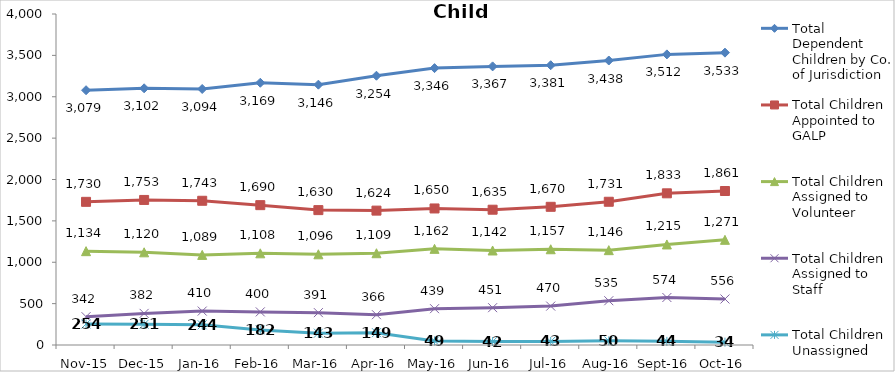
| Category | Total Dependent Children by Co. of Jurisdiction | Total Children Appointed to GALP | Total Children Assigned to Volunteer | Total Children Assigned to Staff | Total Children Unassigned |
|---|---|---|---|---|---|
| Nov-15 | 3079 | 1730 | 1134 | 342 | 254 |
| Dec-15 | 3102 | 1753 | 1120 | 382 | 251 |
| Jan-16 | 3094 | 1743 | 1089 | 410 | 244 |
| Feb-16 | 3169 | 1690 | 1108 | 400 | 182 |
| Mar-16 | 3146 | 1630 | 1096 | 391 | 143 |
| Apr-16 | 3254 | 1624 | 1109 | 366 | 149 |
| May-16 | 3346 | 1650 | 1162 | 439 | 49 |
| Jun-16 | 3367 | 1635 | 1142 | 451 | 42 |
| Jul-16 | 3381 | 1670 | 1157 | 470 | 43 |
| Aug-16 | 3438 | 1731 | 1146 | 535 | 50 |
| Sep-16 | 3512 | 1833 | 1215 | 574 | 44 |
| Oct-16 | 3533 | 1861 | 1271 | 556 | 34 |